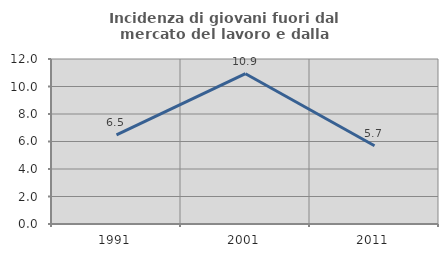
| Category | Incidenza di giovani fuori dal mercato del lavoro e dalla formazione  |
|---|---|
| 1991.0 | 6.487 |
| 2001.0 | 10.929 |
| 2011.0 | 5.693 |